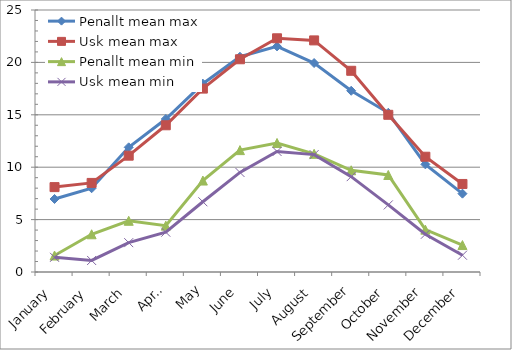
| Category | Penallt mean max | Usk mean max | Penallt mean min | Usk mean min |
|---|---|---|---|---|
| January | 6.968 | 8.1 | 1.571 | 1.4 |
| February | 7.993 | 8.5 | 3.6 | 1.1 |
| March | 11.897 | 11.1 | 4.887 | 2.8 |
| April | 14.6 | 14 | 4.423 | 3.8 |
| May | 17.971 | 17.5 | 8.726 | 6.7 |
| June | 20.54 | 20.3 | 11.63 | 9.5 |
| July | 21.526 | 22.3 | 12.313 | 11.5 |
| August | 19.939 | 22.1 | 11.277 | 11.2 |
| September | 17.293 | 19.2 | 9.707 | 9.1 |
| October | 15.194 | 15 | 9.258 | 6.4 |
| November | 10.27 | 11 | 4.043 | 3.6 |
| December | 7.474 | 8.4 | 2.571 | 1.6 |